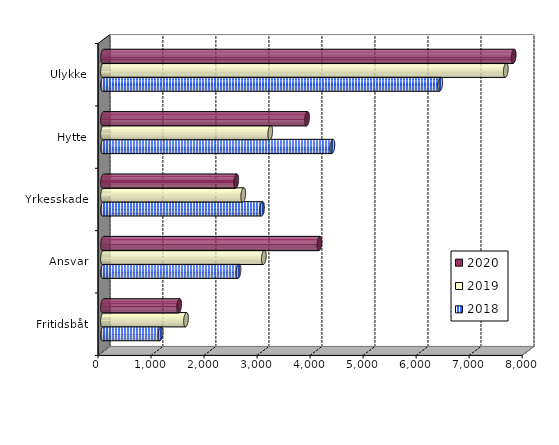
| Category | 2018 | 2019 | 2020 |
|---|---|---|---|
| Fritidsbåt | 1085.206 | 1566.148 | 1436.298 |
| Ansvar | 2556.018 | 3033.528 | 4082.944 |
| Yrkesskade | 3000.34 | 2645.672 | 2512.857 |
| Hytte | 4327.024 | 3154.28 | 3848.886 |
| Ulykke | 6360.053 | 7597.193 | 7746.45 |